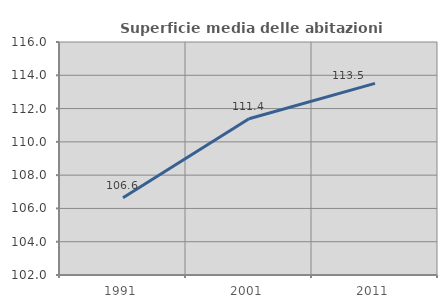
| Category | Superficie media delle abitazioni occupate |
|---|---|
| 1991.0 | 106.636 |
| 2001.0 | 111.387 |
| 2011.0 | 113.514 |